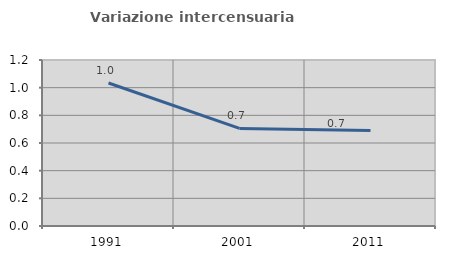
| Category | Variazione intercensuaria annua |
|---|---|
| 1991.0 | 1.034 |
| 2001.0 | 0.706 |
| 2011.0 | 0.69 |